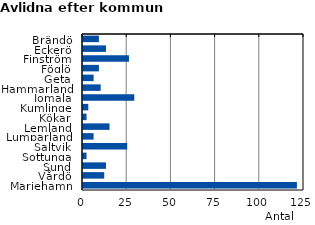
| Category | Series 0 |
|---|---|
| Brändö | 9 |
| Eckerö | 13 |
| Finström | 26 |
| Föglö | 9 |
| Geta | 6 |
| Hammarland | 10 |
| Jomala | 29 |
| Kumlinge | 3 |
| Kökar | 2 |
| Lemland | 15 |
| Lumparland | 6 |
| Saltvik | 25 |
| Sottunga | 2 |
| Sund | 13 |
| Vårdö | 12 |
| Mariehamn | 121 |